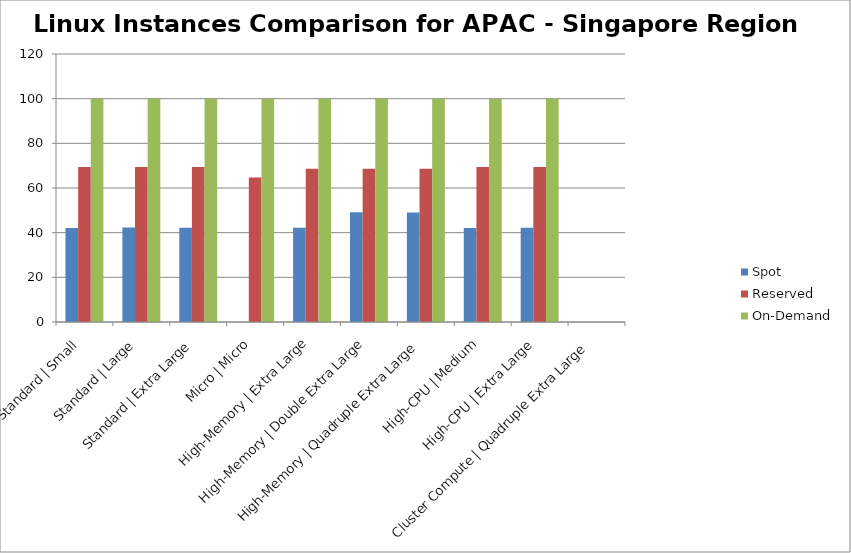
| Category | Spot | Reserved | On-Demand |
|---|---|---|---|
| Standard | Small | 42.132 | 69.442 | 100 |
| Standard | Large | 42.356 | 69.442 | 100 |
| Standard | Extra Large | 42.222 | 69.442 | 100 |
| Micro | Micro | 0 | 64.658 | 100 |
| High-Memory | Extra Large | 42.161 | 68.641 | 100 |
| High-Memory | Double Extra Large | 49.17 | 68.641 | 100 |
| High-Memory | Quadruple Extra Large | 49.085 | 68.641 | 100 |
| High-CPU | Medium | 42.115 | 69.442 | 100 |
| High-CPU | Extra Large | 42.222 | 69.442 | 100 |
| Cluster Compute | Quadruple Extra Large | 0 | 0 | 0 |